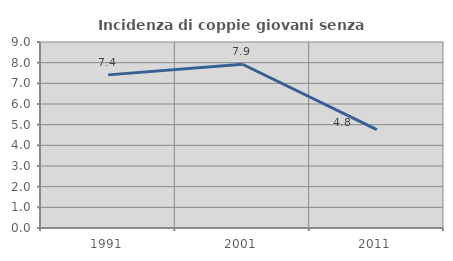
| Category | Incidenza di coppie giovani senza figli |
|---|---|
| 1991.0 | 7.409 |
| 2001.0 | 7.924 |
| 2011.0 | 4.765 |